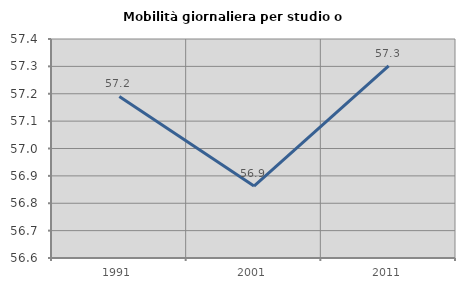
| Category | Mobilità giornaliera per studio o lavoro |
|---|---|
| 1991.0 | 57.19 |
| 2001.0 | 56.863 |
| 2011.0 | 57.301 |